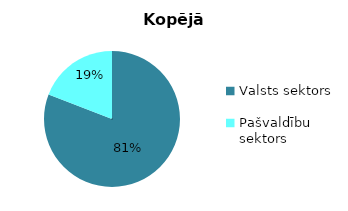
| Category | Kopējā līgumsumma |
|---|---|
| Valsts sektors | 1371431349 |
| Pašvaldību sektors | 324489368 |